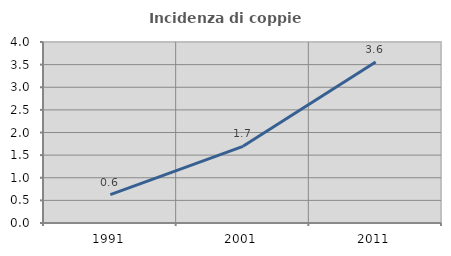
| Category | Incidenza di coppie miste |
|---|---|
| 1991.0 | 0.627 |
| 2001.0 | 1.695 |
| 2011.0 | 3.557 |